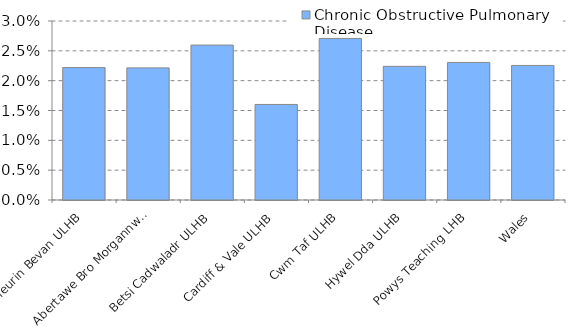
| Category | Chronic Obstructive Pulmonary Disease  |
|---|---|
| Aneurin Bevan ULHB | 0.022 |
| Abertawe Bro Morgannwg ULHB | 0.022 |
| Betsi Cadwaladr ULHB | 0.026 |
| Cardiff & Vale ULHB | 0.016 |
| Cwm Taf ULHB | 0.027 |
| Hywel Dda ULHB | 0.022 |
| Powys Teaching LHB | 0.023 |
| Wales | 0.023 |